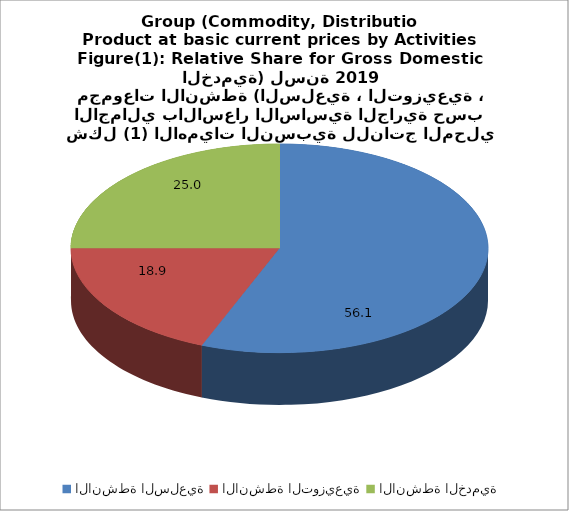
| Category | Series 0 |
|---|---|
| الانشطة السلعية | 56.066 |
| الانشطة التوزيعية | 18.945 |
| الانشطة الخدمية | 24.989 |